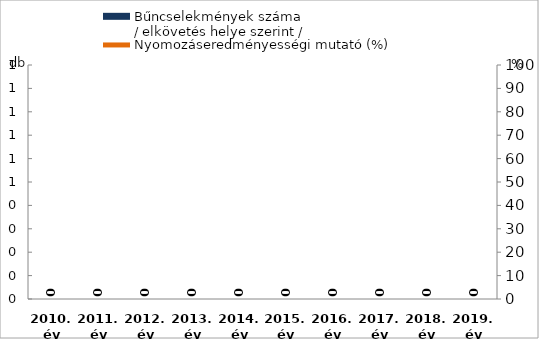
| Category | Bűncselekmények száma
/ elkövetés helye szerint / |
|---|---|
| 2010. év | 0 |
| 2011. év | 0 |
| 2012. év | 0 |
| 2013. év | 0 |
| 2014. év | 0 |
| 2015. év | 0 |
| 2016. év | 0 |
| 2017. év | 0 |
| 2018. év | 0 |
| 2019. év | 0 |